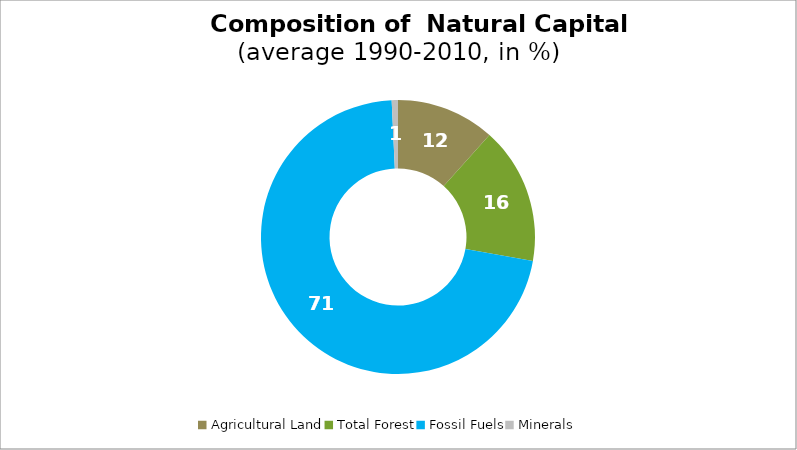
| Category | Series 0 |
|---|---|
| Agricultural Land | 11.631 |
| Total Forest | 16.166 |
| Fossil Fuels | 71.466 |
| Minerals | 0.736 |